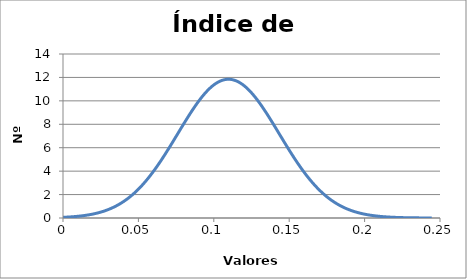
| Category | Series 0 |
|---|---|
| -0.025018536868611996 | 0.004 |
| -0.02229660721203245 | 0.005 |
| -0.019574677555452905 | 0.007 |
| -0.01685274789887336 | 0.01 |
| -0.014130818242293815 | 0.014 |
| -0.011408888585714271 | 0.018 |
| -0.008686958929134727 | 0.025 |
| -0.0059650292725551834 | 0.033 |
| -0.0032430996159756396 | 0.043 |
| -0.0005211699593960957 | 0.056 |
| 0.002200759697183448 | 0.073 |
| 0.004922689353762992 | 0.094 |
| 0.007644619010342536 | 0.12 |
| 0.01036654866692208 | 0.153 |
| 0.013088478323501624 | 0.193 |
| 0.015810407980081168 | 0.243 |
| 0.018532337636660713 | 0.304 |
| 0.02125426729324026 | 0.377 |
| 0.023976196949819804 | 0.464 |
| 0.02669812660639935 | 0.568 |
| 0.029420056262978896 | 0.691 |
| 0.03214198591955844 | 0.835 |
| 0.03486391557613799 | 1.003 |
| 0.03758584523271753 | 1.196 |
| 0.04030777488929708 | 1.417 |
| 0.043029704545876624 | 1.669 |
| 0.04575163420245617 | 1.952 |
| 0.048473563859035715 | 2.268 |
| 0.05119549351561526 | 2.618 |
| 0.053917423172194806 | 3.003 |
| 0.05663935282877435 | 3.422 |
| 0.0593612824853539 | 3.874 |
| 0.06208321214193344 | 4.358 |
| 0.06480514179851299 | 4.869 |
| 0.06752707145509253 | 5.405 |
| 0.07024900111167207 | 5.962 |
| 0.0729709307682516 | 6.532 |
| 0.07569286042483114 | 7.111 |
| 0.07841479008141068 | 7.691 |
| 0.08113671973799022 | 8.263 |
| 0.08385864939456976 | 8.821 |
| 0.0865805790511493 | 9.355 |
| 0.08930250870772884 | 9.857 |
| 0.09202443836430838 | 10.318 |
| 0.09474636802088791 | 10.73 |
| 0.09746829767746745 | 11.086 |
| 0.10019022733404699 | 11.379 |
| 0.10291215699062653 | 11.604 |
| 0.10563408664720607 | 11.757 |
| 0.10835601630378561 | 11.834 |
| 0.11107794596036515 | 11.834 |
| 0.11379987561694468 | 11.757 |
| 0.11652180527352422 | 11.604 |
| 0.11924373493010376 | 11.379 |
| 0.1219656645866833 | 11.086 |
| 0.12468759424326284 | 10.73 |
| 0.1274095238998424 | 10.318 |
| 0.13013145355642194 | 9.857 |
| 0.1328533832130015 | 9.355 |
| 0.13557531286958105 | 8.821 |
| 0.1382972425261606 | 8.263 |
| 0.14101917218274015 | 7.691 |
| 0.1437411018393197 | 7.111 |
| 0.14646303149589926 | 6.532 |
| 0.1491849611524788 | 5.962 |
| 0.15190689080905836 | 5.405 |
| 0.15462882046563792 | 4.869 |
| 0.15735075012221747 | 4.358 |
| 0.16007267977879702 | 3.874 |
| 0.16279460943537657 | 3.422 |
| 0.16551653909195613 | 3.003 |
| 0.16823846874853568 | 2.618 |
| 0.17096039840511523 | 2.268 |
| 0.17368232806169479 | 1.952 |
| 0.17640425771827434 | 1.669 |
| 0.1791261873748539 | 1.417 |
| 0.18184811703143344 | 1.196 |
| 0.184570046688013 | 1.003 |
| 0.18729197634459255 | 0.835 |
| 0.1900139060011721 | 0.691 |
| 0.19273583565775165 | 0.568 |
| 0.1954577653143312 | 0.464 |
| 0.19817969497091076 | 0.377 |
| 0.2009016246274903 | 0.304 |
| 0.20362355428406986 | 0.243 |
| 0.20634548394064942 | 0.193 |
| 0.20906741359722897 | 0.153 |
| 0.21178934325380852 | 0.12 |
| 0.21451127291038807 | 0.094 |
| 0.21723320256696763 | 0.073 |
| 0.21995513222354718 | 0.056 |
| 0.22267706188012673 | 0.043 |
| 0.22539899153670628 | 0.033 |
| 0.22812092119328584 | 0.025 |
| 0.2308428508498654 | 0.018 |
| 0.23356478050644494 | 0.014 |
| 0.2362867101630245 | 0.01 |
| 0.23900863981960405 | 0.007 |
| 0.2417305694761836 | 0.005 |
| 0.24445249913276315 | 0.004 |